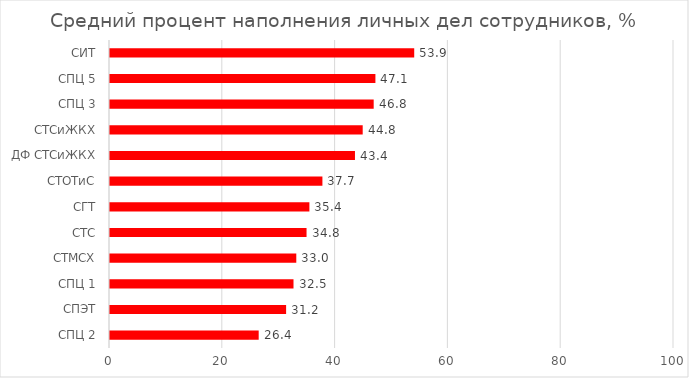
| Category | Series 0 |
|---|---|
| СПЦ 2 | 26.364 |
| СПЭТ | 31.225 |
| СПЦ 1 | 32.536 |
| СТМСХ | 33.03 |
| СТС | 34.848 |
| СГТ | 35.354 |
| СТОТиС | 37.662 |
| ДФ СТСиЖКХ | 43.434 |
| СТСиЖКХ | 44.805 |
| СПЦ 3 | 46.753 |
| СПЦ 5 | 47.059 |
| СИТ | 53.939 |